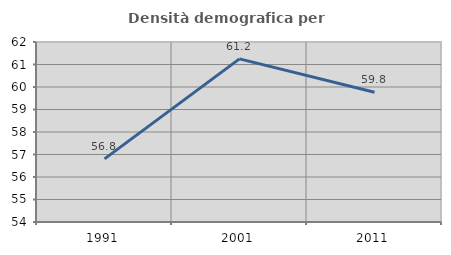
| Category | Densità demografica |
|---|---|
| 1991.0 | 56.804 |
| 2001.0 | 61.25 |
| 2011.0 | 59.768 |